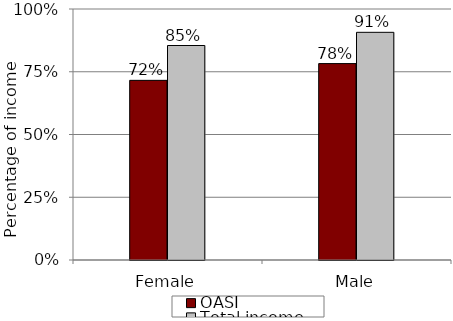
| Category | OASI | Total income |
|---|---|---|
| Female | 0.716 | 0.855 |
| Male | 0.783 | 0.907 |